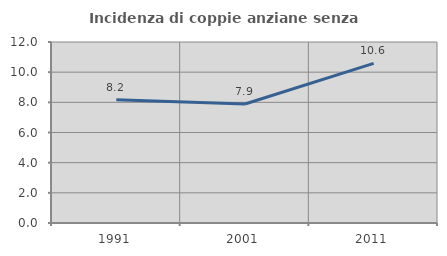
| Category | Incidenza di coppie anziane senza figli  |
|---|---|
| 1991.0 | 8.17 |
| 2001.0 | 7.889 |
| 2011.0 | 10.583 |